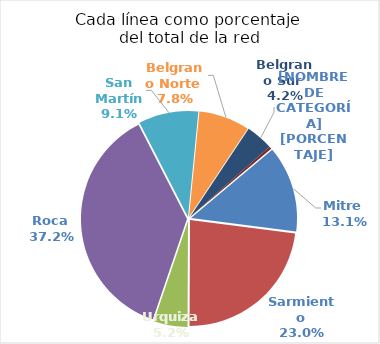
| Category | Total |
|---|---|
| Mitre  | 3682832 |
| Sarmiento  | 6465064 |
| Urquiza  | 1444700 |
| Roca  | 10440045 |
| San Martín  | 2558596 |
| Belgrano Norte  | 2177815 |
| Belgrano Sur  | 1166008 |
| Tren de la Costa  | 113465 |